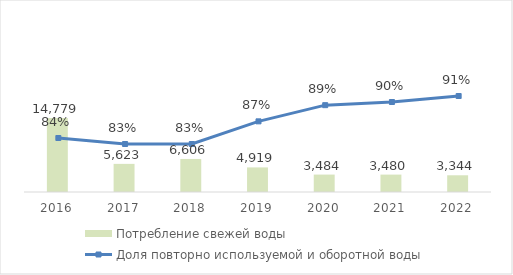
| Category | Потребление свежей воды |
|---|---|
| 2016.0 | 14779 |
| 2017.0 | 5623 |
| 2018.0 | 6606.43 |
| 2019.0 | 4918.53 |
| 2020.0 | 3483.569 |
| 2021.0 | 3480.164 |
| 2022.0 | 3344 |